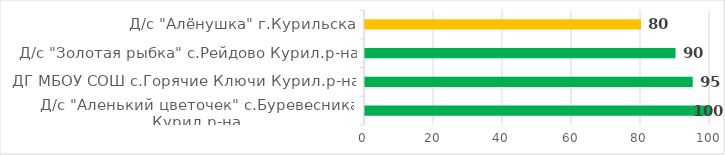
| Category | Series 0 |
|---|---|
| Д/с "Аленький цветочек" с.Буревесника Курил.р-на | 100 |
| ДГ МБОУ СОШ с.Горячие Ключи Курил.р-на | 95 |
| Д/с "Золотая рыбка" с.Рейдово Курил.р-на | 90 |
| Д/с "Алёнушка" г.Курильска | 80 |